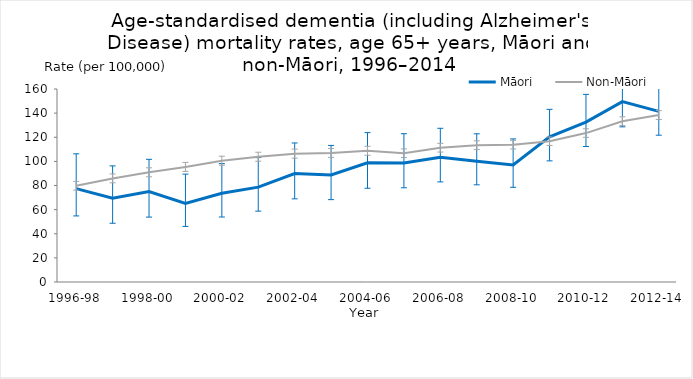
| Category | Māori | Non-Māori |
|---|---|---|
| 1996-98 | 77.421 | 79.706 |
| 1997-99 | 69.52 | 85.857 |
| 1998-00 | 74.964 | 90.892 |
| 1999-01 | 65.137 | 95.362 |
| 2000-02 | 73.582 | 100.499 |
| 2001-03 | 78.641 | 103.815 |
| 2002-04 | 89.916 | 106.353 |
| 2003-05 | 88.672 | 106.953 |
| 2004-06 | 98.797 | 108.741 |
| 2005-07 | 98.645 | 106.722 |
| 2006-08 | 103.431 | 111.295 |
| 2007-09 | 100.065 | 113.423 |
| 2008-10 | 97.027 | 113.814 |
| 2009-11 | 120.373 | 116.67 |
| 2010-12 | 132.62 | 123.453 |
| 2011-13 | 149.564 | 133.29 |
| 2012-14 | 141.462 | 138.385 |